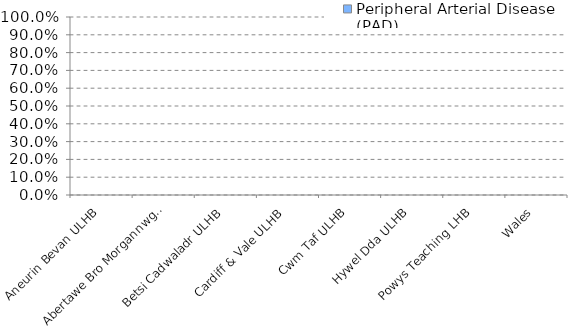
| Category | Peripheral Arterial Disease (PAD) |
|---|---|
| Aneurin Bevan ULHB | 0 |
| Abertawe Bro Morgannwg ULHB | 0 |
| Betsi Cadwaladr ULHB | 0 |
| Cardiff & Vale ULHB | 0 |
| Cwm Taf ULHB | 0 |
| Hywel Dda ULHB | 0 |
| Powys Teaching LHB | 0 |
| Wales | 0 |